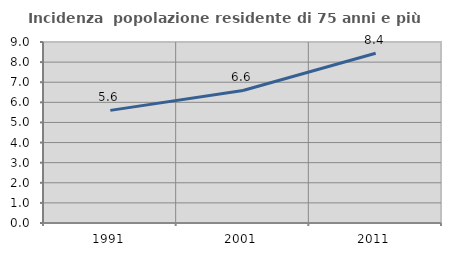
| Category | Incidenza  popolazione residente di 75 anni e più |
|---|---|
| 1991.0 | 5.6 |
| 2001.0 | 6.589 |
| 2011.0 | 8.442 |